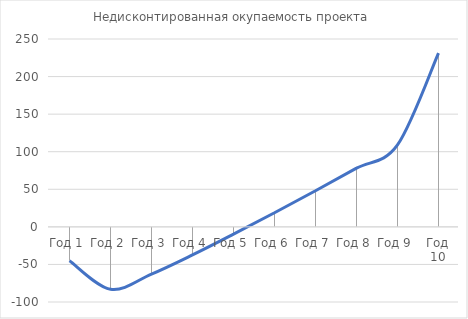
| Category | Недисконтированная окупаемость проекта |
|---|---|
| Год 1 | -45 |
| Год 2 | -82.963 |
| Год 3 | -62.877 |
| Год 4 | -37.367 |
| Год 5 | -9.74 |
| Год 6 | 18.746 |
| Год 7 | 48.115 |
| Год 8 | 78.09 |
| Год 9 | 108.999 |
| Год 10 | 231.228 |